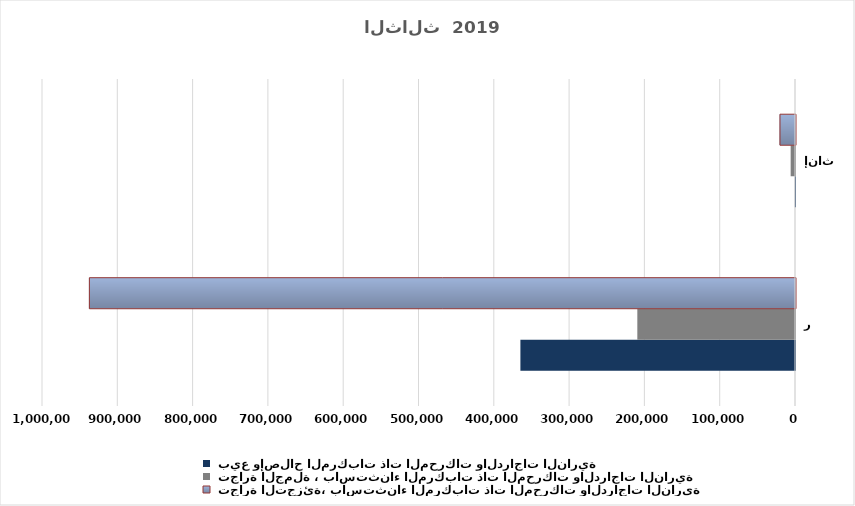
| Category |  بيع وإصلاح المركبات ذات المحركات والدراجات النارية |  تجارة الجملة ، باستثناء المركبات ذات المحركات والدراجات النارية |  تجارة التجزئة، باستثناء المركبات ذات المحركات والدراجات النارية |
|---|---|---|---|
| ذكور | 364669 | 209394 | 937719 |
| إناث | 176 | 5773 | 20605 |